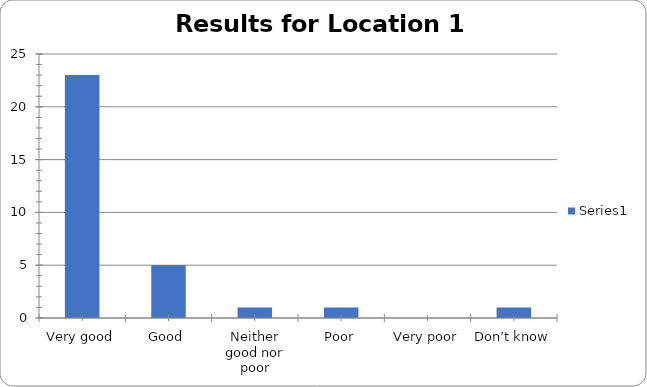
| Category | Series 0 |
|---|---|
| Very good | 23 |
| Good | 5 |
| Neither good nor poor | 1 |
| Poor | 1 |
| Very poor | 0 |
| Don’t know | 1 |